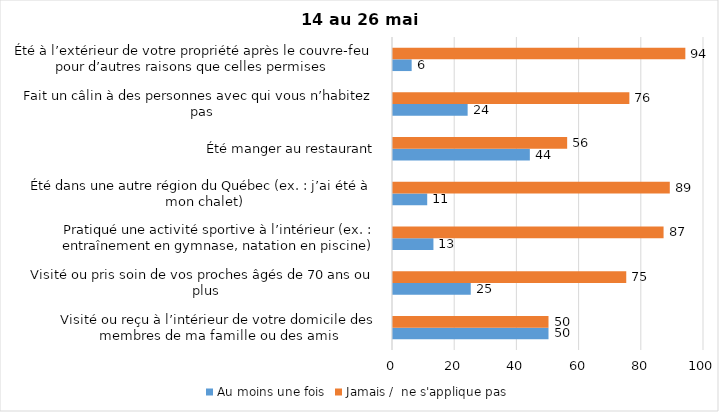
| Category | Au moins une fois | Jamais /  ne s'applique pas |
|---|---|---|
| Visité ou reçu à l’intérieur de votre domicile des membres de ma famille ou des amis | 50 | 50 |
| Visité ou pris soin de vos proches âgés de 70 ans ou plus | 25 | 75 |
| Pratiqué une activité sportive à l’intérieur (ex. : entraînement en gymnase, natation en piscine) | 13 | 87 |
| Été dans une autre région du Québec (ex. : j’ai été à mon chalet) | 11 | 89 |
| Été manger au restaurant | 44 | 56 |
| Fait un câlin à des personnes avec qui vous n’habitez pas | 24 | 76 |
| Été à l’extérieur de votre propriété après le couvre-feu pour d’autres raisons que celles permises  | 6 | 94 |